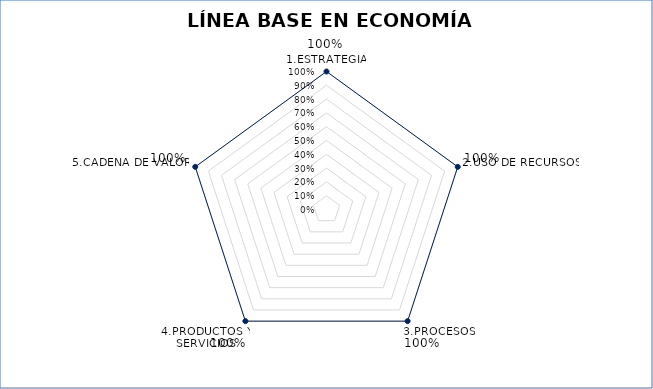
| Category | Series 0 |
|---|---|
| 1.ESTRATEGIA | 1 |
| 2.USO DE RECURSOS | 1 |
| 3.PROCESOS | 1 |
| 4.PRODUCTOS Y SERVICIOS | 1 |
| 5.CADENA DE VALOR | 1 |